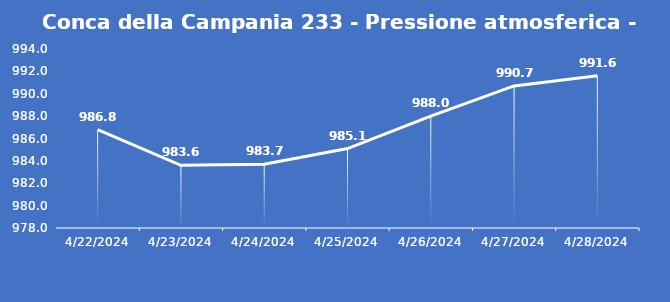
| Category | Conca della Campania 233 - Pressione atmosferica - Grezzo (hPa) |
|---|---|
| 4/22/24 | 986.8 |
| 4/23/24 | 983.6 |
| 4/24/24 | 983.7 |
| 4/25/24 | 985.1 |
| 4/26/24 | 988 |
| 4/27/24 | 990.7 |
| 4/28/24 | 991.6 |